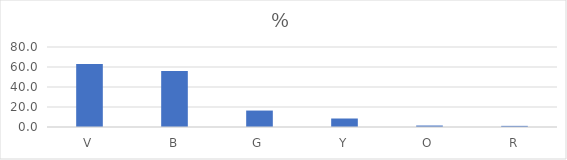
| Category | % |
|---|---|
| V | 63.062 |
| B | 55.974 |
| G | 16.442 |
| Y | 8.498 |
| O | 1.475 |
| R | 1.129 |